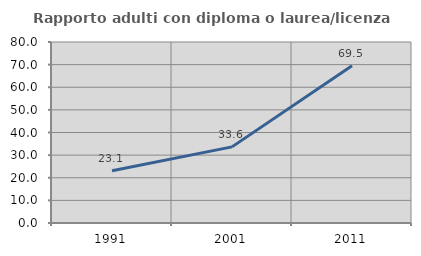
| Category | Rapporto adulti con diploma o laurea/licenza media  |
|---|---|
| 1991.0 | 23.077 |
| 2001.0 | 33.645 |
| 2011.0 | 69.524 |